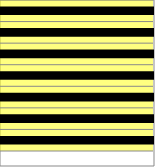
| Category | Series 0 |
|---|---|
| 0 | 1 |
| 1 | 1 |
| 2 | 1 |
| 3 | 1 |
| 4 | 1 |
| 5 | 1 |
| 6 | 1 |